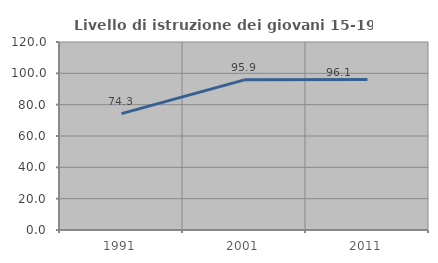
| Category | Livello di istruzione dei giovani 15-19 anni |
|---|---|
| 1991.0 | 74.286 |
| 2001.0 | 95.855 |
| 2011.0 | 96.129 |